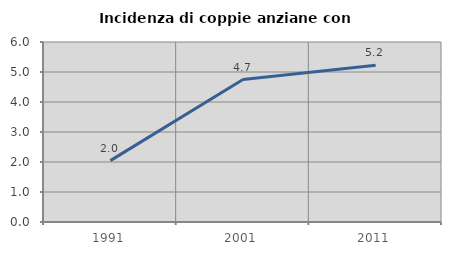
| Category | Incidenza di coppie anziane con figli |
|---|---|
| 1991.0 | 2.046 |
| 2001.0 | 4.748 |
| 2011.0 | 5.225 |